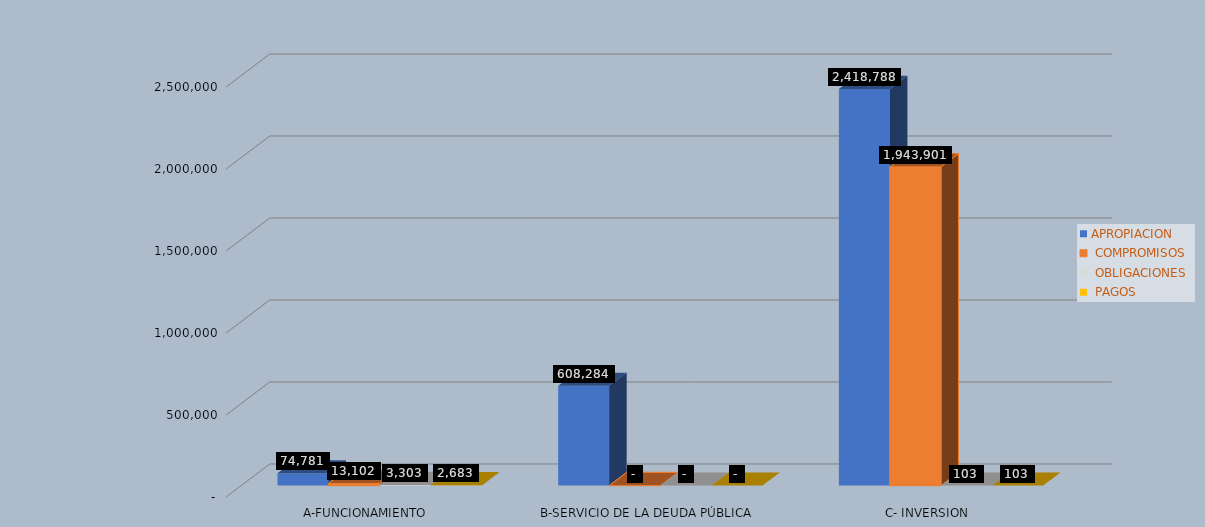
| Category | APROPIACION |  COMPROMISOS |  OBLIGACIONES |  PAGOS |
|---|---|---|---|---|
| A-FUNCIONAMIENTO | 74780.665 | 13101.807 | 3303.188 | 2683.01 |
| B-SERVICIO DE LA DEUDA PÚBLICA | 608283.882 | 0 | 0 | 0 |
| C- INVERSION | 2418788.029 | 1943900.656 | 102.813 | 102.813 |